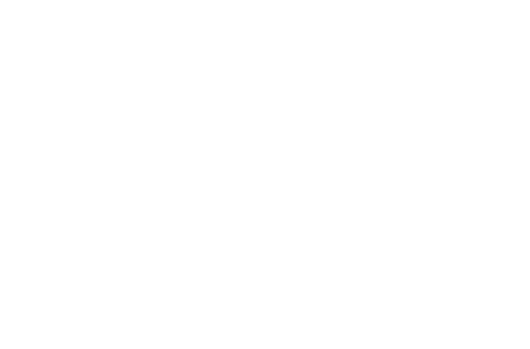
| Category | Principal Paid | Interest Paid |
|---|---|---|
| 2022 | 509.663 | 358.547 |
| 2023 | 1309.985 | 860.541 |
| 2024 | 2155.451 | 1317.39 |
| 2025 | 3048.608 | 1726.548 |
| 2026 | 3992.146 | 2085.325 |
| 2027 | 4988.908 | 2390.879 |
| 2028 | 6041.894 | 2640.208 |
| 2029 | 7154.277 | 2830.141 |
| 2030 | 8329.407 | 2957.326 |
| 2031 | 9570.824 | 3018.224 |
| 2032 | 10000 | 3023.153 |